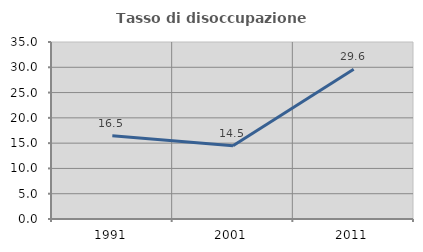
| Category | Tasso di disoccupazione giovanile  |
|---|---|
| 1991.0 | 16.471 |
| 2001.0 | 14.493 |
| 2011.0 | 29.63 |